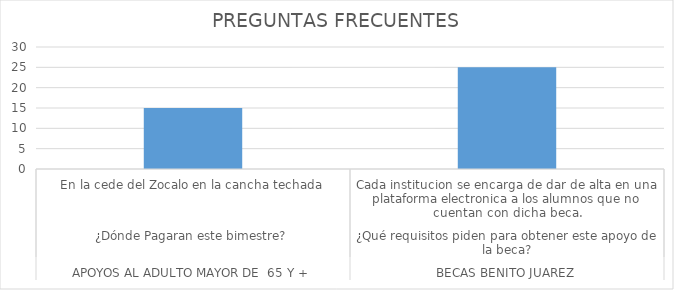
| Category | NUMERO DE PREGUNTAS REALIZADAS |
|---|---|
| 0 | 15 |
| 1 | 25 |